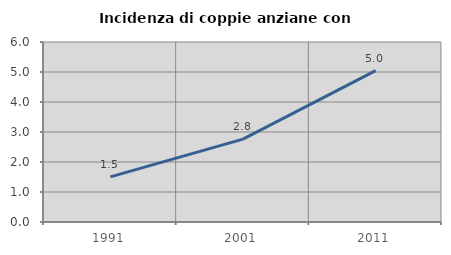
| Category | Incidenza di coppie anziane con figli |
|---|---|
| 1991.0 | 1.506 |
| 2001.0 | 2.763 |
| 2011.0 | 5.044 |